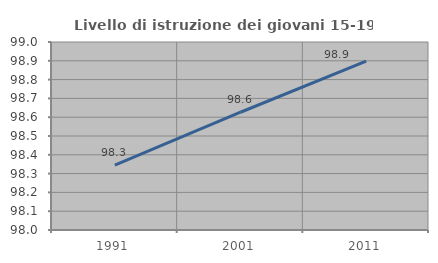
| Category | Livello di istruzione dei giovani 15-19 anni |
|---|---|
| 1991.0 | 98.345 |
| 2001.0 | 98.626 |
| 2011.0 | 98.898 |